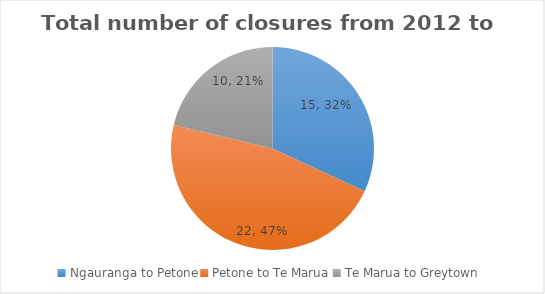
| Category | Total number of closures from 2012 to 2016 |
|---|---|
| Ngauranga to Petone | 15 |
| Petone to Te Marua | 22 |
| Te Marua to Greytown | 10 |